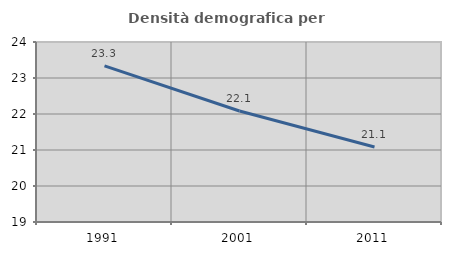
| Category | Densità demografica |
|---|---|
| 1991.0 | 23.337 |
| 2001.0 | 22.084 |
| 2011.0 | 21.085 |